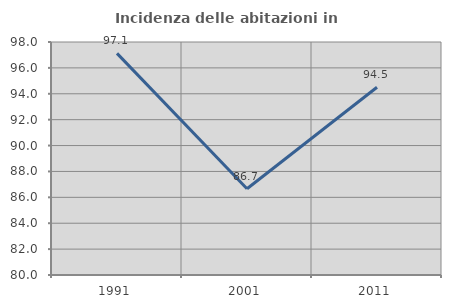
| Category | Incidenza delle abitazioni in proprietà  |
|---|---|
| 1991.0 | 97.122 |
| 2001.0 | 86.667 |
| 2011.0 | 94.505 |